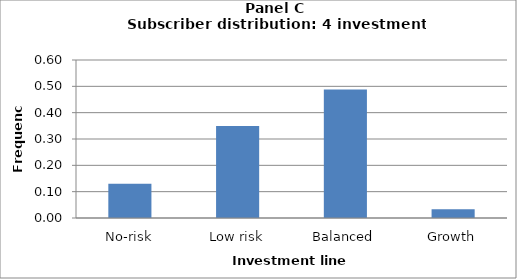
| Category | Series 0 |
|---|---|
| No-risk | 0.13 |
| Low risk | 0.349 |
| Balanced | 0.488 |
| Growth | 0.033 |